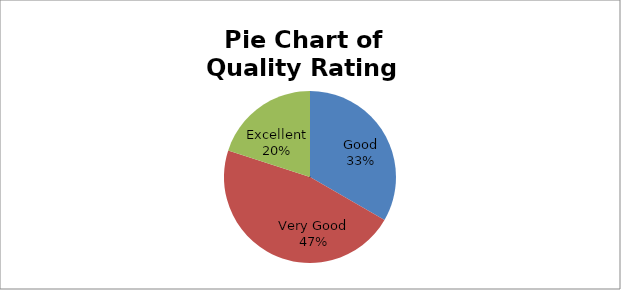
| Category | Series 0 |
|---|---|
| Good | 5 |
| Very Good | 7 |
| Excellent | 3 |